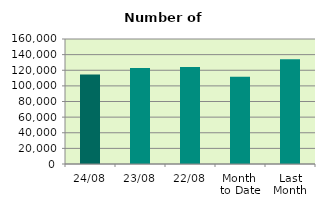
| Category | Series 0 |
|---|---|
| 24/08 | 114506 |
| 23/08 | 122888 |
| 22/08 | 124136 |
| Month 
to Date | 111813.667 |
| Last
Month | 134197.333 |